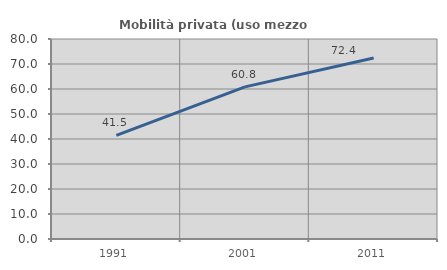
| Category | Mobilità privata (uso mezzo privato) |
|---|---|
| 1991.0 | 41.48 |
| 2001.0 | 60.842 |
| 2011.0 | 72.419 |